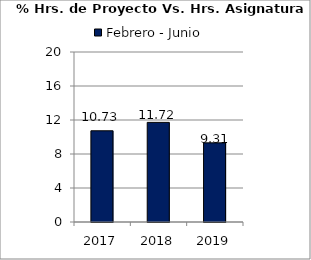
| Category | Febrero - Junio |
|---|---|
| 2017.0 | 10.73 |
| 2018.0 | 11.72 |
| 2019.0 | 9.31 |